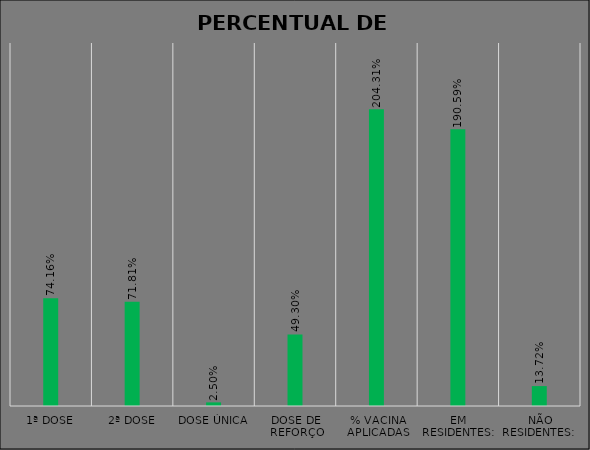
| Category | Series 0 |
|---|---|
| 1ª Dose | 0.742 |
| 2ª Dose | 0.718 |
| Dose Única | 0.025 |
| Dose de reforço | 0.493 |
| % Vacina aplicadas | 2.043 |
| Em residentes: | 1.906 |
| Não residentes:  | 0.137 |